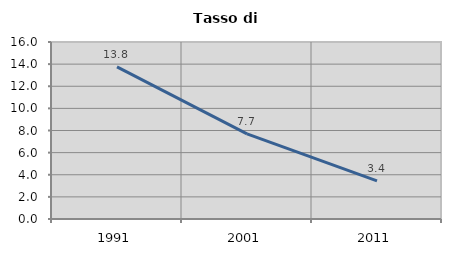
| Category | Tasso di disoccupazione   |
|---|---|
| 1991.0 | 13.75 |
| 2001.0 | 7.692 |
| 2011.0 | 3.448 |